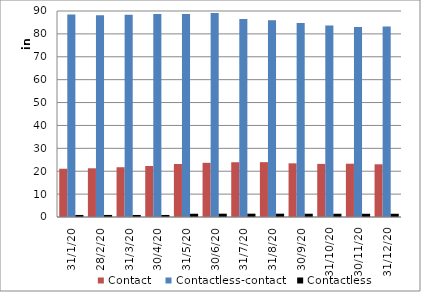
| Category | Contact | Contactless-contact | Contactless |
|---|---|---|---|
| 31/1/20 | 21088 | 88509 | 894 |
| 28/2/20 | 21282 | 88185 | 898 |
| 31/3/20 | 21743 | 88356 | 896 |
| 30/4/20 | 22295 | 88671 | 896 |
| 31/5/20 | 23154 | 88678 | 1425 |
| 30/6/20 | 23666 | 89166 | 1449 |
| 31/7/20 | 23928 | 86492 | 1450 |
| 31/8/20 | 23965 | 85956 | 1452 |
| 30/9/20 | 23451 | 84783 | 1433 |
| 31/10/20 | 23194 | 83689 | 1427 |
| 30/11/20 | 23279 | 83003 | 1421 |
| 31/12/20 | 23030 | 83204 | 1420 |